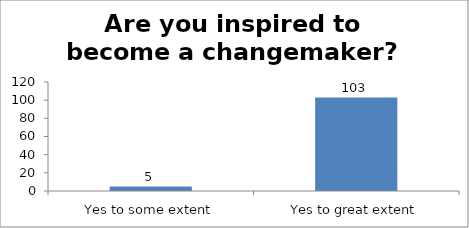
| Category | Are you inspired to become a changemaker?   |
|---|---|
| Yes to some extent | 5 |
| Yes to great extent | 103 |